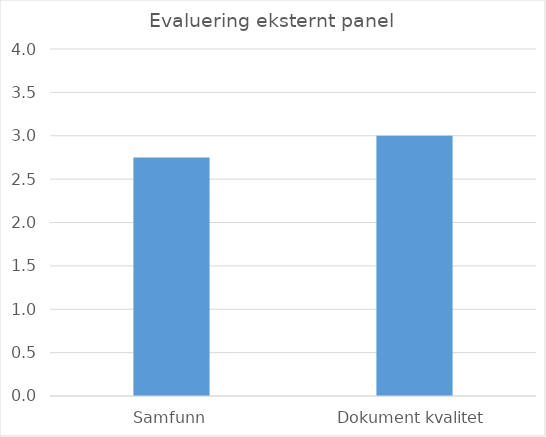
| Category | Series 0 |
|---|---|
| Samfunn | 2.75 |
| Dokument kvalitet | 3 |